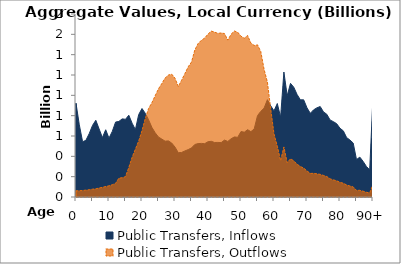
| Category | Public Transfers, Inflows | Public Transfers, Outflows |
|---|---|---|
| 0 | 921.679 | 60.249 |
|  | 709.954 | 62.231 |
| 2 | 543.223 | 63.846 |
| 3 | 557.566 | 67.515 |
| 4 | 622.926 | 71.669 |
| 5 | 703.705 | 77.049 |
| 6 | 754.898 | 80.384 |
| 7 | 669.495 | 88.261 |
| 8 | 584.259 | 94.968 |
| 9 | 661.36 | 103.054 |
| 10 | 579.052 | 109.846 |
| 11 | 645.391 | 120.795 |
| 12 | 737.181 | 134.09 |
| 13 | 743.327 | 185.093 |
| 14 | 768.673 | 189.859 |
| 15 | 764.004 | 200.069 |
| 16 | 804.454 | 290.289 |
| 17 | 725.926 | 389.891 |
| 18 | 662.639 | 470.783 |
| 19 | 810.872 | 550.638 |
| 20 | 870.236 | 652.592 |
| 21 | 822.974 | 772.147 |
| 22 | 758.757 | 871.322 |
| 23 | 684.421 | 927.54 |
| 24 | 631.603 | 996.665 |
| 25 | 589.531 | 1064.216 |
| 26 | 569.996 | 1115.464 |
| 27 | 549.017 | 1170.062 |
| 28 | 552.148 | 1199.281 |
| 29 | 530.654 | 1208.334 |
| 30 | 491.113 | 1168.242 |
| 31 | 435.687 | 1087.324 |
| 32 | 438.142 | 1148.476 |
| 33 | 453.124 | 1213.91 |
| 34 | 466.186 | 1280.269 |
| 35 | 482.751 | 1327.226 |
| 36 | 516.399 | 1445.367 |
| 37 | 525.429 | 1509.112 |
| 38 | 527.077 | 1541.4 |
| 39 | 524.765 | 1563.387 |
| 40 | 543.537 | 1602.271 |
| 41 | 547.879 | 1631.551 |
| 42 | 536.079 | 1621.9 |
| 43 | 536.693 | 1609.017 |
| 44 | 535.222 | 1613.616 |
| 45 | 560.031 | 1607.457 |
| 46 | 546.056 | 1542.928 |
| 47 | 572.938 | 1600.645 |
| 48 | 590.791 | 1632.405 |
| 49 | 586.876 | 1620.417 |
| 50 | 643.78 | 1581.769 |
| 51 | 637.654 | 1561.695 |
| 52 | 661.959 | 1589.026 |
| 53 | 642.501 | 1513.274 |
| 54 | 669.204 | 1490.443 |
| 55 | 799.98 | 1496.851 |
| 56 | 842.64 | 1429.981 |
| 57 | 874.324 | 1254.336 |
| 58 | 956.879 | 1130.576 |
| 59 | 897.367 | 867.211 |
| 60 | 847.381 | 620.11 |
| 61 | 919.661 | 499.851 |
| 62 | 785.18 | 357.761 |
| 63 | 1229.091 | 492.412 |
| 64 | 995.213 | 336.598 |
| 65 | 1117.829 | 375.977 |
| 66 | 1079.184 | 355.241 |
| 67 | 1008.093 | 322.439 |
| 68 | 955.621 | 299.562 |
| 69 | 955.532 | 284.269 |
| 70 | 876.824 | 256.127 |
| 71 | 822.969 | 231.721 |
| 72 | 857.178 | 232.756 |
| 73 | 876.952 | 228.001 |
| 74 | 889.889 | 222.69 |
| 75 | 837.102 | 212.026 |
| 76 | 813.69 | 201.107 |
| 77 | 757.173 | 178.716 |
| 78 | 741.234 | 168.348 |
| 79 | 720.853 | 159.426 |
| 80 | 675.964 | 144.097 |
| 81 | 650.989 | 135.7 |
| 82 | 584.658 | 118.263 |
| 83 | 560.907 | 108.151 |
| 84 | 530.585 | 99.014 |
| 85 | 368.208 | 65.118 |
| 86 | 392.104 | 65.948 |
| 87 | 350.714 | 56.781 |
| 88 | 300.601 | 46.631 |
| 89 | 267.301 | 39.697 |
| 90+ | 987.333 | 124.176 |